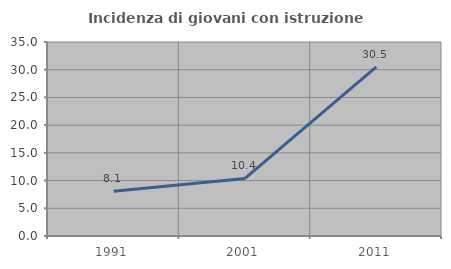
| Category | Incidenza di giovani con istruzione universitaria |
|---|---|
| 1991.0 | 8.057 |
| 2001.0 | 10.382 |
| 2011.0 | 30.528 |